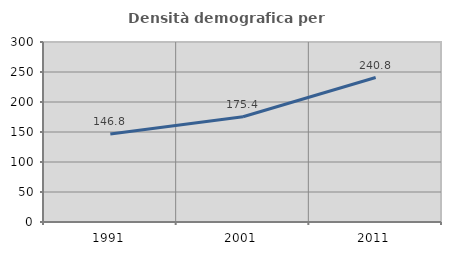
| Category | Densità demografica |
|---|---|
| 1991.0 | 146.788 |
| 2001.0 | 175.42 |
| 2011.0 | 240.782 |